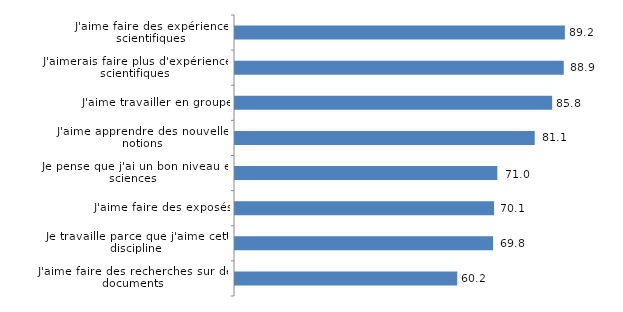
| Category | Series 0 |
|---|---|
| J'aime faire des recherches sur des documents | 60.17 |
| Je travaille parce que j'aime cette discipline | 69.83 |
| J'aime faire des exposés | 70.1 |
| Je pense que j'ai un bon niveau en sciences  | 70.97 |
| J'aime apprendre des nouvelles notions | 81.06 |
| J'aime travailler en groupe | 85.76 |
| J'aimerais faire plus d'expériences scientifiques | 88.89 |
| J'aime faire des expériences scientifiques | 89.18 |